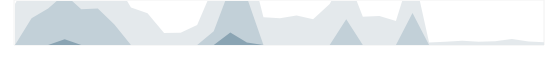
| Category | Безопасность | Series 1 | Series 2 | Series 3 |
|---|---|---|---|---|
| 0.333333333333333 | 685 | 0 | 0 | 0 |
| nan | 1196 | 446 | 0 | 0 |
| nan | 1360 | 610 | 0 | 0 |
| nan | 1597 | 847 | 97 | 0 |
| 0.416666666666667 | 1344 | 594 | 0 | 0 |
| nan | 1358 | 608 | 0 | 0 |
| nan | 1091 | 341 | 0 | 0 |
| nan | 625 | 0 | 0 | 0 |
| 0.5 | 531 | 0 | 0 | 0 |
| nan | 198 | 0 | 0 | 0 |
| nan | 203 | 0 | 0 | 0 |
| nan | 332 | 0 | 0 | 0 |
| 0.583333333333333 | 979 | 229 | 0 | 0 |
| nan | 1708 | 958 | 208 | 0 |
| nan | 1543 | 793 | 43 | 0 |
| nan | 462 | 0 | 0 | 0 |
| 0.666666666666667 | 447 | 0 | 0 | 0 |
| nan | 490 | 0 | 0 | 0 |
| nan | 429 | 0 | 0 | 0 |
| nan | 683 | 0 | 0 | 0 |
| 0.75 | 1180 | 430 | 0 | 0 |
| nan | 471 | 0 | 0 | 0 |
| nan | 483 | 0 | 0 | 0 |
| nan | 400 | 0 | 0 | 0 |
| 0.833333333333333 | 1283 | 533 | 0 | 0 |
| nan | 40 | 0 | 0 | 0 |
| nan | 56 | 0 | 0 | 0 |
| nan | 71 | 0 | 0 | 0 |
| 0.916666666666667 | 53 | 0 | 0 | 0 |
| nan | 61 | 0 | 0 | 0 |
| nan | 99 | 0 | 0 | 0 |
| nan | 60 | 0 | 0 | 0 |
| 0.9993055555555556 | 44 | 0 | 0 | 0 |